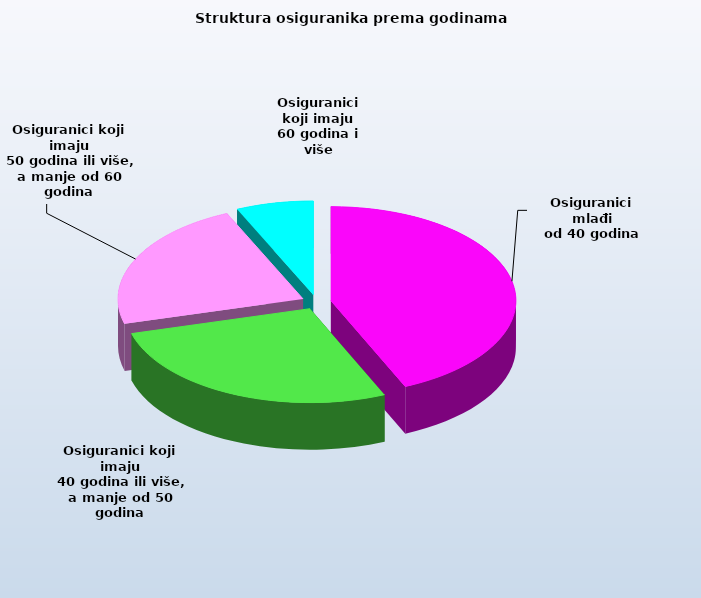
| Category | Series 0 |
|---|---|
| Osiguranici mlađi
od 40 godina | 666898 |
| Osiguranici koji imaju
 40 godina ili više, a manje od 50 godina | 419687 |
| Osiguranici koji imaju
 50 godina ili više, a manje od 60 godina | 345955 |
| Osiguranici koji imaju
60 godina i više | 103760 |